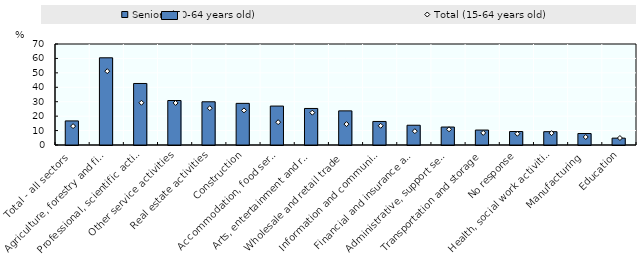
| Category | Seniors (50-64 years old) |
|---|---|
| Total - all sectors | 16.688 |
| Agriculture, forestry and fishing | 60.429 |
| Professional, scientific activities | 42.639 |
| Other service activities | 30.831 |
| Real estate activities | 29.957 |
| Construction | 28.859 |
| Accommodation, food services | 26.983 |
| Arts, entertainment and recreation | 25.322 |
| Wholesale and retail trade | 23.652 |
| Information and communication | 16.318 |
| Financial and insurance activities | 13.697 |
| Administrative, support services | 12.45 |
| Transportation and storage | 10.361 |
| No response | 9.336 |
| Health, social work activities | 9.236 |
| Manufacturing | 7.952 |
| Education | 4.744 |